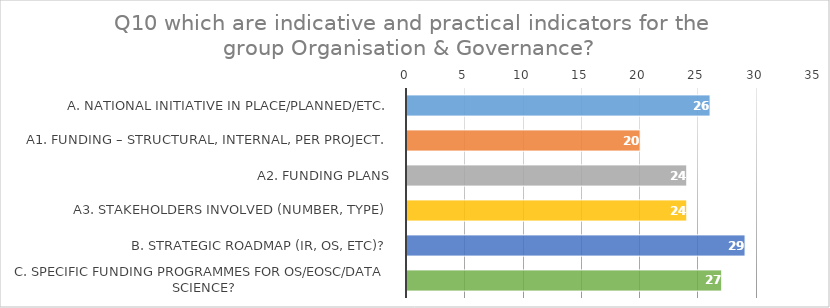
| Category | Series 0 |
|---|---|
| A. National Initiative in place/planned/etc. | 26 |
| a1. Funding – structural, internal, per project. | 20 |
| a2. Funding plans | 24 |
| a3. Stakeholders involved (number, type) | 24 |
| B. Strategic roadmap (IR, OS, etc)? | 29 |
| C. Specific funding programmes for OS/EOSC/data science? | 27 |